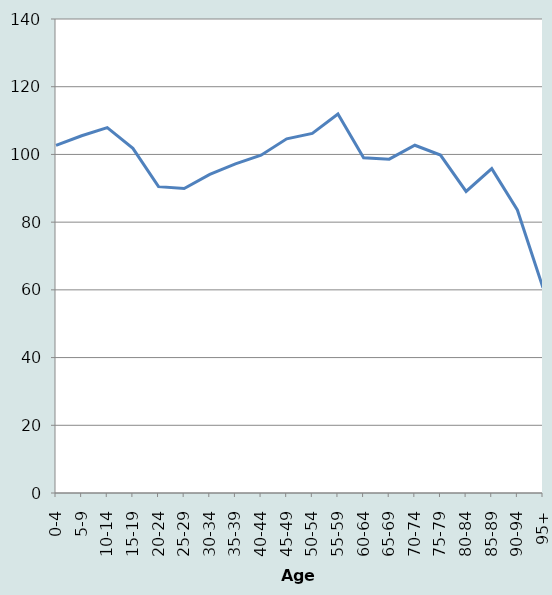
| Category | Male |
|---|---|
| 0-4 | 102.702 |
| 5-9 | 105.525 |
| 10-14 | 107.91 |
| 15-19 | 101.784 |
| 20-24 | 90.478 |
| 25-29 | 89.933 |
| 30-34 | 94.104 |
| 35-39 | 97.215 |
| 40-44 | 99.786 |
| 45-49 | 104.602 |
| 50-54 | 106.202 |
| 55-59 | 111.927 |
| 60-64 | 98.983 |
| 65-69 | 98.613 |
| 70-74 | 102.711 |
| 75-79 | 99.805 |
| 80-84 | 89.072 |
| 85-89 | 95.817 |
| 90-94 | 83.607 |
| 95+ | 60.598 |